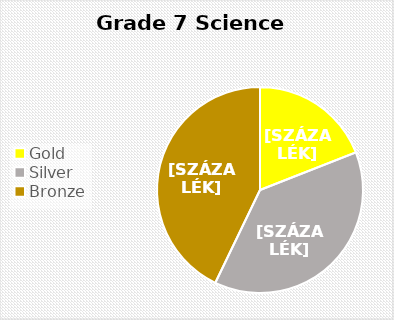
| Category | Series 0 |
|---|---|
| Gold | 4 |
| Silver | 8 |
| Bronze  | 9 |